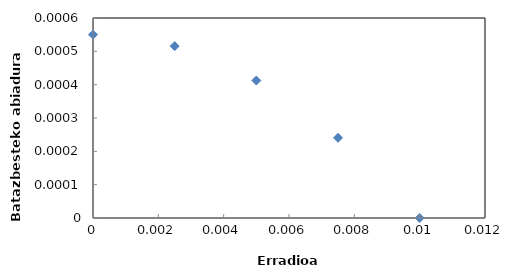
| Category | Series 0 |
|---|---|
| 0.0 | 0.001 |
| 0.0025 | 0.001 |
| 0.005 | 0 |
| 0.0075 | 0 |
| 0.01 | 0 |